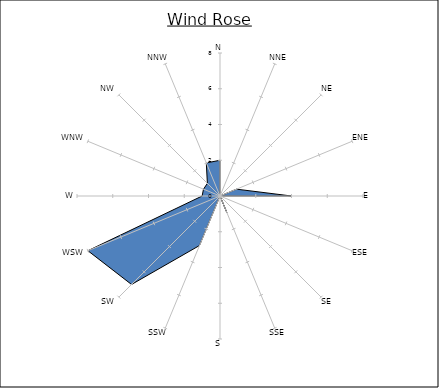
| Category | Series 0 |
|---|---|
| N | 2 |
| NNE | 0 |
| NE | 0 |
| ENE | 1 |
| E | 4 |
| ESE | 0 |
| SE | 0 |
| SSE | 1 |
| S | 0 |
| SSW | 3 |
| SW | 7 |
| WSW | 8 |
| W | 1 |
| WNW | 1 |
| NW | 1 |
| NNW | 2 |